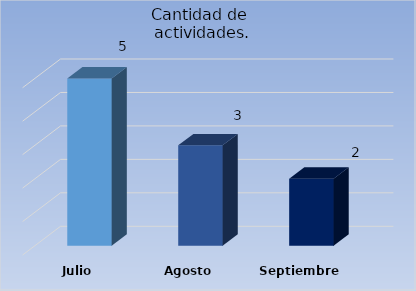
| Category | Cantidad de 
actividades. |
|---|---|
| Julio | 5 |
| Agosto | 3 |
| Septiembre | 2 |